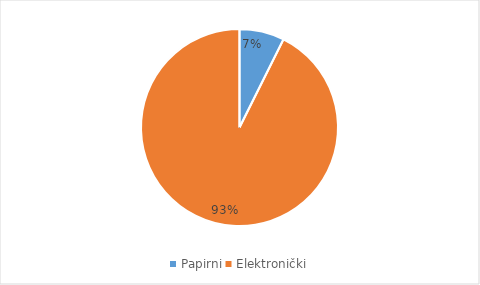
| Category | Series 0 |
|---|---|
| Papirni | 103125182789 |
| Elektronički | 1297104662260 |